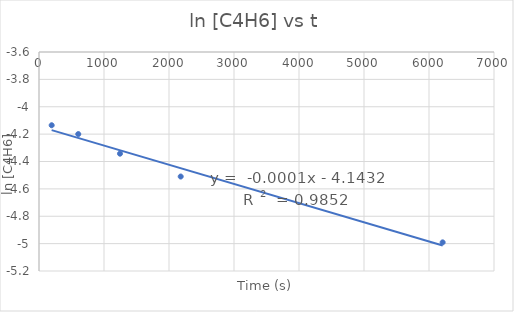
| Category | Series 0 |
|---|---|
| 195.0 | -4.135 |
| 604.0 | -4.2 |
| 1246.0 | -4.343 |
| 2180.0 | -4.51 |
| 6210.0 | -4.991 |